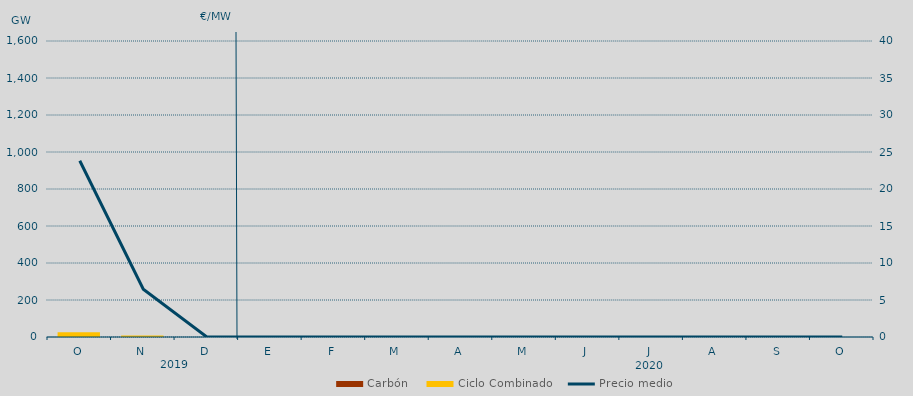
| Category | Carbón | Ciclo Combinado |
|---|---|---|
| O | 0 | 25712.6 |
| N | 0 | 8552.1 |
| D | 0 | 0 |
| E | 0 | 0 |
| F | 0 | 0 |
| M | 0 | 0 |
| A | 0 | 0 |
| M | 0 | 0 |
| J | 0 | 0 |
| J | 0 | 0 |
| A | 0 | 0 |
| S | 0 | 0 |
| O | 0 | 0 |